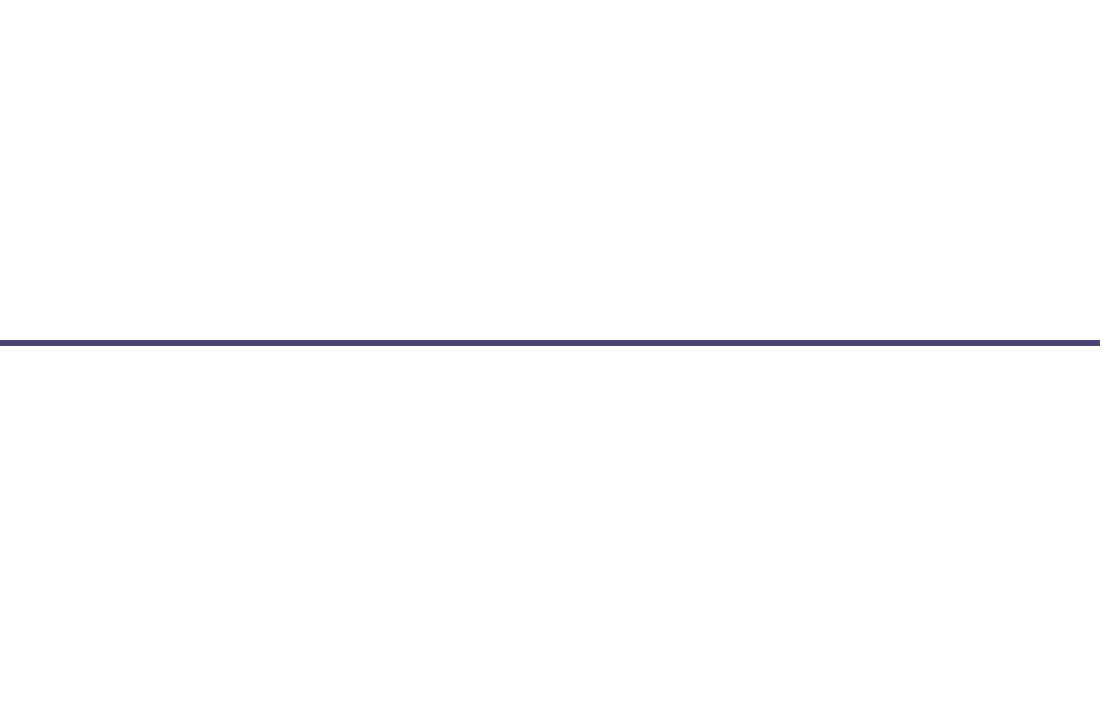
| Category | Позиція |
|---|---|
| 0 | 1 |
| 1 | -2 |
| 2 | 1 |
| 3 | -1 |
| 4 | -0.5 |
| 5 | 2 |
| 6 | 0.5 |
| 7 | -1 |
| 8 | 0.5 |
| 9 | -2 |